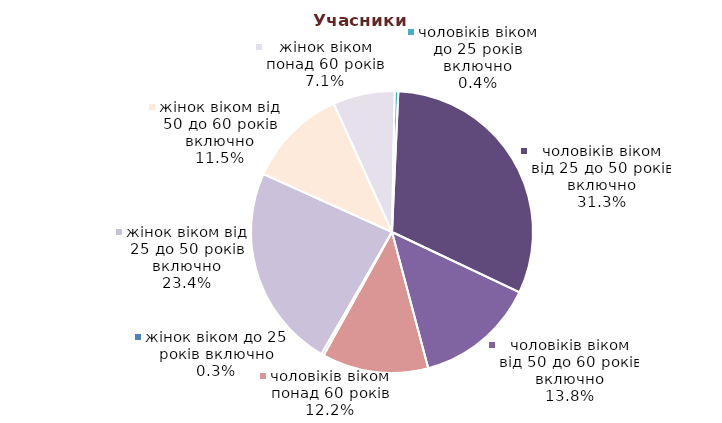
| Category | Series 0 |
|---|---|
| жінок віком до 25 років включно | 2547 |
| жінок віком від 25 до 50 років включно | 203732 |
| жінок віком від 50 до 60 років включно | 99965 |
| жінок віком понад 60 років | 61818 |
| чоловіків віком до 25 років включно | 3597 |
| чоловіків віком від 25 до 50 років включно | 272824 |
| чоловіків віком від 50 до 60 років включно | 120470 |
| чоловіків віком понад 60 років | 106250 |